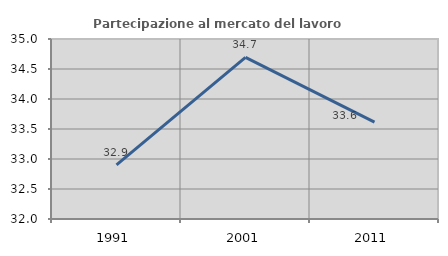
| Category | Partecipazione al mercato del lavoro  femminile |
|---|---|
| 1991.0 | 32.903 |
| 2001.0 | 34.694 |
| 2011.0 | 33.613 |